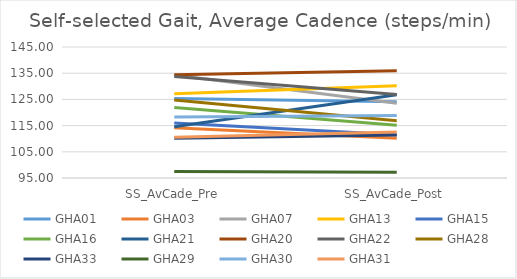
| Category | GHA01 | GHA03 | GHA07 | GHA13 | GHA15 | GHA16 | GHA21 | GHA20 | GHA22 | GHA28 | GHA33 | GHA29 | GHA30 | GHA31 |
|---|---|---|---|---|---|---|---|---|---|---|---|---|---|---|
| SS_AvCade_Pre | 125.375 | 114.212 | 134.352 | 127.179 | 116.03 | 121.912 | 114.583 | 134.397 | 133.714 | 124.79 | 110.149 | 97.507 | 118.269 | 110.557 |
| SS_AvCade_Post | 124.151 | 110.16 | 123.573 | 130.235 | 111.504 | 115.114 | 126.742 | 135.919 | 126.874 | 116.833 | 111.419 | 97.189 | 118.892 | 112.604 |